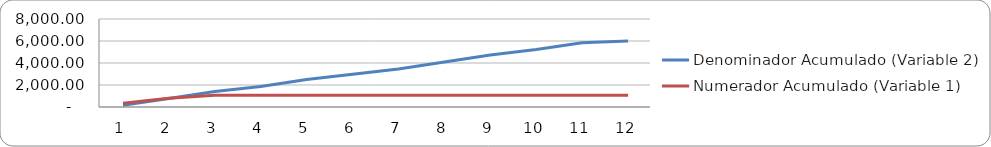
| Category | Denominador Acumulado (Variable 2) | Numerador Acumulado (Variable 1) |
|---|---|---|
| 0 | 150 | 331 |
| 1 | 780 | 805 |
| 2 | 1410 | 1077 |
| 3 | 1870 | 1077 |
| 4 | 2500 | 1077 |
| 5 | 2980 | 1077 |
| 6 | 3460 | 1077 |
| 7 | 4090 | 1077 |
| 8 | 4720 | 1077 |
| 9 | 5220 | 1077 |
| 10 | 5850 | 1077 |
| 11 | 6000 | 1077 |